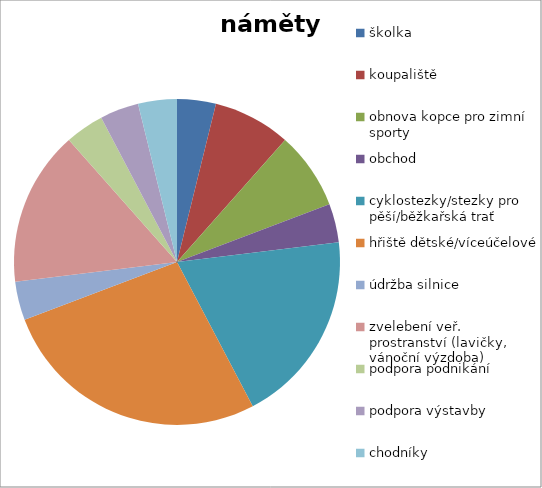
| Category | náměty rozvoje |
|---|---|
| školka | 1 |
| koupaliště | 2 |
| obnova kopce pro zimní sporty | 2 |
| obchod | 1 |
| cyklostezky/stezky pro pěší/běžkařská trať | 5 |
| hřiště dětské/víceúčelové | 7 |
| údržba silnice | 1 |
| zvelebení veř. prostranství (lavičky, vánoční výzdoba) | 4 |
| podpora podnikání | 1 |
| podpora výstavby | 1 |
| chodníky | 1 |